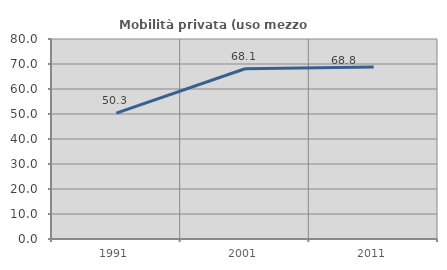
| Category | Mobilità privata (uso mezzo privato) |
|---|---|
| 1991.0 | 50.32 |
| 2001.0 | 68.094 |
| 2011.0 | 68.762 |